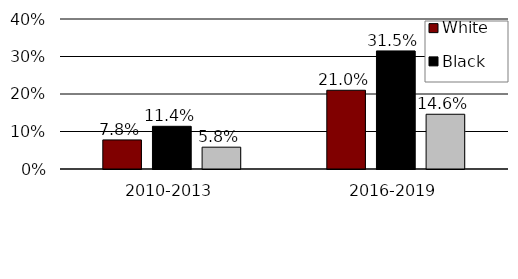
| Category | White | Black | Hispanic |
|---|---|---|---|
| 2010-2013 | 0.078 | 0.114 | 0.058 |
| 2016-2019 | 0.21 | 0.315 | 0.146 |